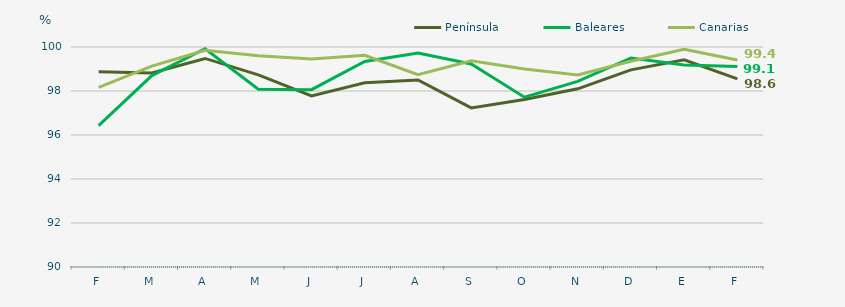
| Category | Península | Baleares | Canarias |
|---|---|---|---|
| F | 98.87 | 96.43 | 98.16 |
| M | 98.82 | 98.7 | 99.13 |
| A | 99.48 | 99.92 | 99.85 |
| M | 98.73 | 98.08 | 99.6 |
| J | 97.78 | 98.06 | 99.45 |
| J | 98.37 | 99.34 | 99.62 |
| A | 98.5 | 99.73 | 98.74 |
| S | 97.23 | 99.23 | 99.37 |
| O | 97.61 | 97.72 | 99 |
| N | 98.1 | 98.44 | 98.73 |
| D | 98.96 | 99.5 | 99.35 |
| E | 99.42 | 99.18 | 99.9 |
| F | 98.55 | 99.11 | 99.41 |